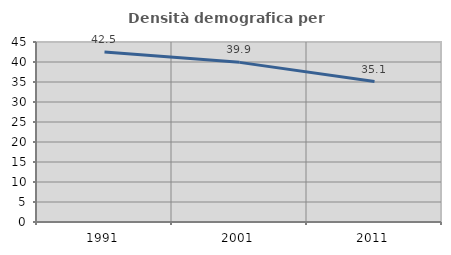
| Category | Densità demografica |
|---|---|
| 1991.0 | 42.524 |
| 2001.0 | 39.91 |
| 2011.0 | 35.103 |